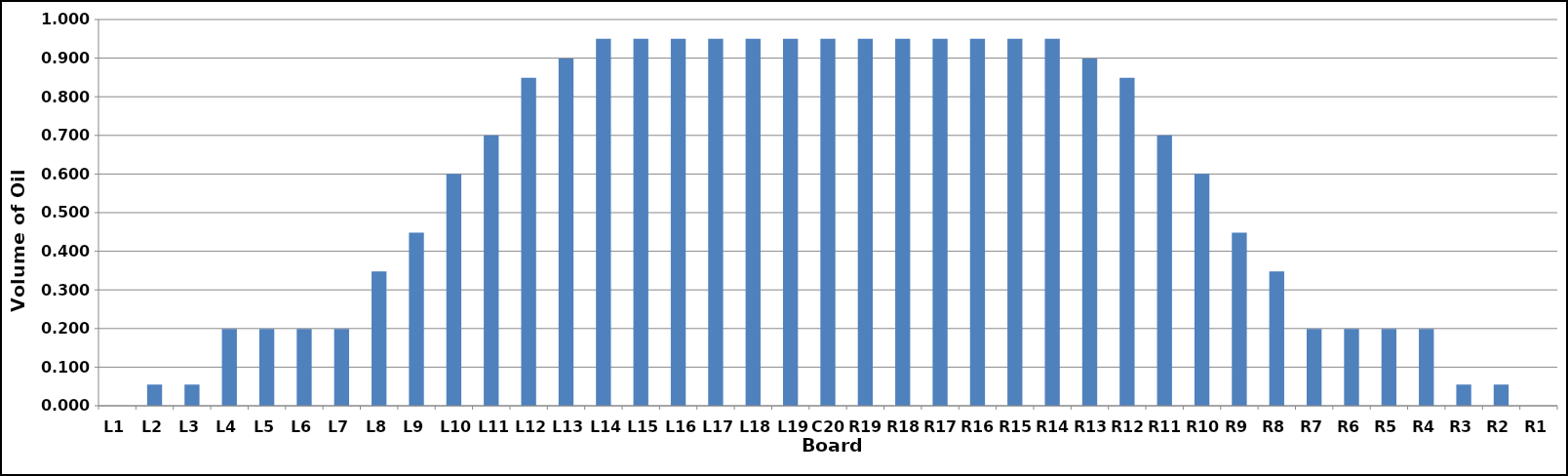
| Category | Series 0 |
|---|---|
| L1 | 0 |
| L2 | 0.055 |
| L3 | 0.055 |
| L4 | 0.199 |
| L5 | 0.199 |
| L6 | 0.199 |
| L7 | 0.199 |
| L8 | 0.348 |
| L9 | 0.449 |
| L10 | 0.6 |
| L11 | 0.7 |
| L12 | 0.849 |
| L13 | 0.899 |
| L14 | 0.95 |
| L15 | 0.95 |
| L16 | 0.95 |
| L17 | 0.95 |
| L18 | 0.95 |
| L19 | 0.95 |
| C20 | 0.95 |
| R19 | 0.95 |
| R18 | 0.95 |
| R17 | 0.95 |
| R16 | 0.95 |
| R15 | 0.95 |
| R14 | 0.95 |
| R13 | 0.899 |
| R12 | 0.849 |
| R11 | 0.7 |
| R10 | 0.6 |
| R9 | 0.449 |
| R8 | 0.348 |
| R7 | 0.199 |
| R6 | 0.199 |
| R5 | 0.199 |
| R4 | 0.199 |
| R3 | 0.055 |
| R2 | 0.055 |
| R1 | 0 |